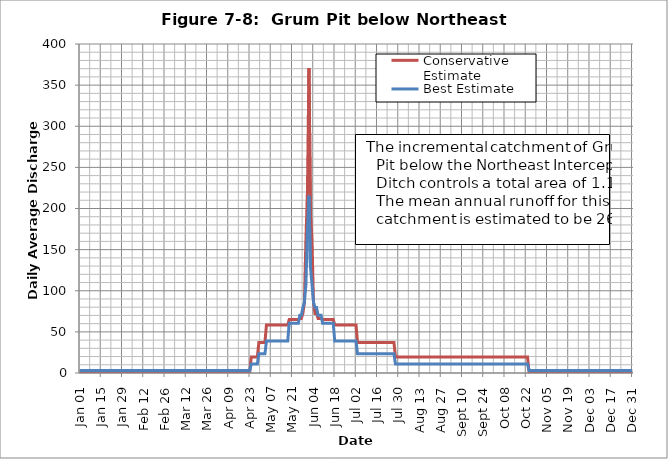
| Category | Conservative Estimate | Best Estimate |
|---|---|---|
| 2005-01-01 | 1.586 | 3.142 |
| 2005-01-02 | 1.586 | 3.142 |
| 2005-01-03 | 1.586 | 3.142 |
| 2005-01-04 | 1.586 | 3.142 |
| 2005-01-05 | 1.586 | 3.142 |
| 2005-01-06 | 1.586 | 3.142 |
| 2005-01-07 | 1.586 | 3.142 |
| 2005-01-08 | 1.586 | 3.142 |
| 2005-01-09 | 1.586 | 3.142 |
| 2005-01-10 | 1.586 | 3.142 |
| 2005-01-11 | 1.586 | 3.142 |
| 2005-01-12 | 1.586 | 3.142 |
| 2005-01-13 | 1.586 | 3.142 |
| 2005-01-14 | 1.586 | 3.142 |
| 2005-01-15 | 1.586 | 3.142 |
| 2005-01-16 | 1.586 | 3.142 |
| 2005-01-17 | 1.586 | 3.142 |
| 2005-01-18 | 1.586 | 3.142 |
| 2005-01-19 | 1.586 | 3.142 |
| 2005-01-20 | 1.586 | 3.142 |
| 2005-01-21 | 1.586 | 3.142 |
| 2005-01-22 | 1.586 | 3.142 |
| 2005-01-23 | 1.586 | 3.142 |
| 2005-01-24 | 1.586 | 3.142 |
| 2005-01-25 | 1.586 | 3.142 |
| 2005-01-26 | 1.586 | 3.142 |
| 2005-01-27 | 1.586 | 3.142 |
| 2005-01-28 | 1.586 | 3.142 |
| 2005-01-29 | 1.586 | 3.142 |
| 2005-01-30 | 1.586 | 3.142 |
| 2005-01-31 | 1.586 | 3.142 |
| 2005-02-01 | 1.586 | 3.142 |
| 2005-02-02 | 1.586 | 3.142 |
| 2005-02-03 | 1.586 | 3.142 |
| 2005-02-04 | 1.586 | 3.142 |
| 2005-02-05 | 1.586 | 3.142 |
| 2005-02-06 | 1.586 | 3.142 |
| 2005-02-07 | 1.586 | 3.142 |
| 2005-02-08 | 1.586 | 3.142 |
| 2005-02-09 | 1.586 | 3.142 |
| 2005-02-10 | 1.586 | 3.142 |
| 2005-02-11 | 1.586 | 3.142 |
| 2005-02-12 | 1.586 | 3.142 |
| 2005-02-13 | 1.586 | 3.142 |
| 2005-02-14 | 1.586 | 3.142 |
| 2005-02-15 | 1.586 | 3.142 |
| 2005-02-16 | 1.586 | 3.142 |
| 2005-02-17 | 1.586 | 3.142 |
| 2005-02-18 | 1.586 | 3.142 |
| 2005-02-19 | 1.586 | 3.142 |
| 2005-02-20 | 1.586 | 3.142 |
| 2005-02-21 | 1.586 | 3.142 |
| 2005-02-22 | 1.586 | 3.142 |
| 2005-02-23 | 1.586 | 3.142 |
| 2005-02-24 | 1.586 | 3.142 |
| 2005-02-25 | 1.586 | 3.142 |
| 2005-02-26 | 1.586 | 3.142 |
| 2005-02-27 | 1.586 | 3.142 |
| 2005-02-28 | 1.586 | 3.142 |
| 2005-03-01 | 1.586 | 3.142 |
| 2005-03-02 | 1.586 | 3.142 |
| 2005-03-03 | 1.586 | 3.142 |
| 2005-03-04 | 1.586 | 3.142 |
| 2005-03-05 | 1.586 | 3.142 |
| 2005-03-06 | 1.586 | 3.142 |
| 2005-03-07 | 1.586 | 3.142 |
| 2005-03-08 | 1.586 | 3.142 |
| 2005-03-09 | 1.586 | 3.142 |
| 2005-03-10 | 1.586 | 3.142 |
| 2005-03-11 | 1.586 | 3.142 |
| 2005-03-12 | 1.586 | 3.142 |
| 2005-03-13 | 1.586 | 3.142 |
| 2005-03-14 | 1.586 | 3.142 |
| 2005-03-15 | 1.586 | 3.142 |
| 2005-03-16 | 1.586 | 3.142 |
| 2005-03-17 | 1.586 | 3.142 |
| 2005-03-18 | 1.586 | 3.142 |
| 2005-03-19 | 1.586 | 3.142 |
| 2005-03-20 | 1.586 | 3.142 |
| 2005-03-21 | 1.586 | 3.142 |
| 2005-03-22 | 1.586 | 3.142 |
| 2005-03-23 | 1.586 | 3.142 |
| 2005-03-24 | 1.586 | 3.142 |
| 2005-03-25 | 1.586 | 3.142 |
| 2005-03-26 | 1.586 | 3.142 |
| 2005-03-27 | 1.586 | 3.142 |
| 2005-03-28 | 1.586 | 3.142 |
| 2005-03-29 | 1.586 | 3.142 |
| 2005-03-30 | 1.586 | 3.142 |
| 2005-03-31 | 1.586 | 3.142 |
| 2005-04-01 | 1.586 | 3.142 |
| 2005-04-02 | 1.586 | 3.142 |
| 2005-04-03 | 1.586 | 3.142 |
| 2005-04-04 | 1.586 | 3.142 |
| 2005-04-05 | 1.586 | 3.142 |
| 2005-04-06 | 1.586 | 3.142 |
| 2005-04-07 | 1.586 | 3.142 |
| 2005-04-08 | 1.586 | 3.142 |
| 2005-04-09 | 1.586 | 3.142 |
| 2005-04-10 | 1.586 | 3.142 |
| 2005-04-11 | 1.586 | 3.142 |
| 2005-04-12 | 1.586 | 3.142 |
| 2005-04-13 | 1.586 | 3.142 |
| 2005-04-14 | 1.586 | 3.142 |
| 2005-04-15 | 1.586 | 3.142 |
| 2005-04-16 | 1.586 | 3.142 |
| 2005-04-17 | 1.586 | 3.142 |
| 2005-04-18 | 1.586 | 3.142 |
| 2005-04-19 | 1.586 | 3.142 |
| 2005-04-20 | 1.586 | 3.142 |
| 2005-04-21 | 1.586 | 3.142 |
| 2005-04-22 | 1.586 | 3.142 |
| 2005-04-23 | 1.586 | 3.142 |
| 2005-04-24 | 19.514 | 10.882 |
| 2005-04-25 | 19.514 | 10.882 |
| 2005-04-26 | 19.514 | 10.882 |
| 2005-04-27 | 19.514 | 10.882 |
| 2005-04-28 | 19.514 | 10.882 |
| 2005-04-29 | 37.036 | 23.37 |
| 2005-04-30 | 37.036 | 23.37 |
| 2005-05-01 | 37.036 | 23.37 |
| 2005-05-02 | 37.036 | 23.37 |
| 2005-05-03 | 37.036 | 23.37 |
| 2005-05-04 | 58.487 | 38.863 |
| 2005-05-05 | 58.487 | 38.863 |
| 2005-05-06 | 58.487 | 38.863 |
| 2005-05-07 | 58.487 | 38.863 |
| 2005-05-08 | 58.487 | 38.863 |
| 2005-05-09 | 58.487 | 38.863 |
| 2005-05-10 | 58.487 | 38.863 |
| 2005-05-11 | 58.487 | 38.863 |
| 2005-05-12 | 58.487 | 38.863 |
| 2005-05-13 | 58.487 | 38.863 |
| 2005-05-14 | 58.487 | 38.863 |
| 2005-05-15 | 58.487 | 38.863 |
| 2005-05-16 | 58.487 | 38.863 |
| 2005-05-17 | 58.487 | 38.863 |
| 2005-05-18 | 58.487 | 38.863 |
| 2005-05-19 | 65.039 | 60.485 |
| 2005-05-20 | 65.039 | 60.485 |
| 2005-05-21 | 65.039 | 60.485 |
| 2005-05-22 | 65.039 | 60.485 |
| 2005-05-23 | 65.039 | 60.485 |
| 2005-05-24 | 65.039 | 60.485 |
| 2005-05-25 | 65.039 | 60.485 |
| 2005-05-26 | 66.398 | 70.12 |
| 2005-05-27 | 66.398 | 70.12 |
| 2005-05-28 | 72.401 | 79.548 |
| 2005-05-29 | 85.786 | 85.753 |
| 2005-05-30 | 161.646 | 107.992 |
| 2005-05-31 | 219.933 | 171.855 |
| 2005-06-01 | 370.5 | 215.408 |
| 2005-06-02 | 195.141 | 128.679 |
| 2005-06-03 | 161.646 | 107.992 |
| 2005-06-04 | 85.786 | 85.753 |
| 2005-06-05 | 72.401 | 79.548 |
| 2005-06-06 | 72.401 | 79.548 |
| 2005-06-07 | 66.398 | 70.12 |
| 2005-06-08 | 66.398 | 70.12 |
| 2005-06-09 | 66.398 | 70.12 |
| 2005-06-10 | 65.039 | 60.485 |
| 2005-06-11 | 65.039 | 60.485 |
| 2005-06-12 | 65.039 | 60.485 |
| 2005-06-13 | 65.039 | 60.485 |
| 2005-06-14 | 65.039 | 60.485 |
| 2005-06-15 | 65.039 | 60.485 |
| 2005-06-16 | 65.039 | 60.485 |
| 2005-06-17 | 65.039 | 60.485 |
| 2005-06-18 | 58.487 | 38.863 |
| 2005-06-19 | 58.487 | 38.863 |
| 2005-06-20 | 58.487 | 38.863 |
| 2005-06-21 | 58.487 | 38.863 |
| 2005-06-22 | 58.487 | 38.863 |
| 2005-06-23 | 58.487 | 38.863 |
| 2005-06-24 | 58.487 | 38.863 |
| 2005-06-25 | 58.487 | 38.863 |
| 2005-06-26 | 58.487 | 38.863 |
| 2005-06-27 | 58.487 | 38.863 |
| 2005-06-28 | 58.487 | 38.863 |
| 2005-06-29 | 58.487 | 38.863 |
| 2005-06-30 | 58.487 | 38.863 |
| 2005-07-01 | 58.487 | 38.863 |
| 2005-07-02 | 58.487 | 38.863 |
| 2005-07-03 | 37.036 | 23.37 |
| 2005-07-04 | 37.036 | 23.37 |
| 2005-07-05 | 37.036 | 23.37 |
| 2005-07-06 | 37.036 | 23.37 |
| 2005-07-07 | 37.036 | 23.37 |
| 2005-07-08 | 37.036 | 23.37 |
| 2005-07-09 | 37.036 | 23.37 |
| 2005-07-10 | 37.036 | 23.37 |
| 2005-07-11 | 37.036 | 23.37 |
| 2005-07-12 | 37.036 | 23.37 |
| 2005-07-13 | 37.036 | 23.37 |
| 2005-07-14 | 37.036 | 23.37 |
| 2005-07-15 | 37.036 | 23.37 |
| 2005-07-16 | 37.036 | 23.37 |
| 2005-07-17 | 37.036 | 23.37 |
| 2005-07-18 | 37.036 | 23.37 |
| 2005-07-19 | 37.036 | 23.37 |
| 2005-07-20 | 37.036 | 23.37 |
| 2005-07-21 | 37.036 | 23.37 |
| 2005-07-22 | 37.036 | 23.37 |
| 2005-07-23 | 37.036 | 23.37 |
| 2005-07-24 | 37.036 | 23.37 |
| 2005-07-25 | 37.036 | 23.37 |
| 2005-07-26 | 37.036 | 23.37 |
| 2005-07-27 | 37.036 | 23.37 |
| 2005-07-28 | 19.514 | 10.882 |
| 2005-07-29 | 19.514 | 10.882 |
| 2005-07-30 | 19.514 | 10.882 |
| 2005-07-31 | 19.514 | 10.882 |
| 2005-08-01 | 19.514 | 10.882 |
| 2005-08-02 | 19.514 | 10.882 |
| 2005-08-03 | 19.514 | 10.882 |
| 2005-08-04 | 19.514 | 10.882 |
| 2005-08-05 | 19.514 | 10.882 |
| 2005-08-06 | 19.514 | 10.882 |
| 2005-08-07 | 19.514 | 10.882 |
| 2005-08-08 | 19.514 | 10.882 |
| 2005-08-09 | 19.514 | 10.882 |
| 2005-08-10 | 19.514 | 10.882 |
| 2005-08-11 | 19.514 | 10.882 |
| 2005-08-12 | 19.514 | 10.882 |
| 2005-08-13 | 19.514 | 10.882 |
| 2005-08-14 | 19.514 | 10.882 |
| 2005-08-15 | 19.514 | 10.882 |
| 2005-08-16 | 19.514 | 10.882 |
| 2005-08-17 | 19.514 | 10.882 |
| 2005-08-18 | 19.514 | 10.882 |
| 2005-08-19 | 19.514 | 10.882 |
| 2005-08-20 | 19.514 | 10.882 |
| 2005-08-21 | 19.514 | 10.882 |
| 2005-08-22 | 19.514 | 10.882 |
| 2005-08-23 | 19.514 | 10.882 |
| 2005-08-24 | 19.514 | 10.882 |
| 2005-08-25 | 19.514 | 10.882 |
| 2005-08-26 | 19.514 | 10.882 |
| 2005-08-27 | 19.514 | 10.882 |
| 2005-08-28 | 19.514 | 10.882 |
| 2005-08-29 | 19.514 | 10.882 |
| 2005-08-30 | 19.514 | 10.882 |
| 2005-08-31 | 19.514 | 10.882 |
| 2005-09-01 | 19.514 | 10.882 |
| 2005-09-02 | 19.514 | 10.882 |
| 2005-09-03 | 19.514 | 10.882 |
| 2005-09-04 | 19.514 | 10.882 |
| 2005-09-05 | 19.514 | 10.882 |
| 2005-09-06 | 19.514 | 10.882 |
| 2005-09-07 | 19.514 | 10.882 |
| 2005-09-08 | 19.514 | 10.882 |
| 2005-09-09 | 19.514 | 10.882 |
| 2005-09-10 | 19.514 | 10.882 |
| 2005-09-11 | 19.514 | 10.882 |
| 2005-09-12 | 19.514 | 10.882 |
| 2005-09-13 | 19.514 | 10.882 |
| 2005-09-14 | 19.514 | 10.882 |
| 2005-09-15 | 19.514 | 10.882 |
| 2005-09-16 | 19.514 | 10.882 |
| 2005-09-17 | 19.514 | 10.882 |
| 2005-09-18 | 19.514 | 10.882 |
| 2005-09-19 | 19.514 | 10.882 |
| 2005-09-20 | 19.514 | 10.882 |
| 2005-09-21 | 19.514 | 10.882 |
| 2005-09-22 | 19.514 | 10.882 |
| 2005-09-23 | 19.514 | 10.882 |
| 2005-09-24 | 19.514 | 10.882 |
| 2005-09-25 | 19.514 | 10.882 |
| 2005-09-26 | 19.514 | 10.882 |
| 2005-09-27 | 19.514 | 10.882 |
| 2005-09-28 | 19.514 | 10.882 |
| 2005-09-29 | 19.514 | 10.882 |
| 2005-09-30 | 19.514 | 10.882 |
| 2005-10-01 | 19.514 | 10.882 |
| 2005-10-02 | 19.514 | 10.882 |
| 2005-10-03 | 19.514 | 10.882 |
| 2005-10-04 | 19.514 | 10.882 |
| 2005-10-05 | 19.514 | 10.882 |
| 2005-10-06 | 19.514 | 10.882 |
| 2005-10-07 | 19.514 | 10.882 |
| 2005-10-08 | 19.514 | 10.882 |
| 2005-10-09 | 19.514 | 10.882 |
| 2005-10-10 | 19.514 | 10.882 |
| 2005-10-11 | 19.514 | 10.882 |
| 2005-10-12 | 19.514 | 10.882 |
| 2005-10-13 | 19.514 | 10.882 |
| 2005-10-14 | 19.514 | 10.882 |
| 2005-10-15 | 19.514 | 10.882 |
| 2005-10-16 | 19.514 | 10.882 |
| 2005-10-17 | 19.514 | 10.882 |
| 2005-10-18 | 19.514 | 10.882 |
| 2005-10-19 | 19.514 | 10.882 |
| 2005-10-20 | 19.514 | 10.882 |
| 2005-10-21 | 19.514 | 10.882 |
| 2005-10-22 | 19.514 | 10.882 |
| 2005-10-23 | 19.514 | 10.882 |
| 2005-10-24 | 1.586 | 3.142 |
| 2005-10-25 | 1.586 | 3.142 |
| 2005-10-26 | 1.586 | 3.142 |
| 2005-10-27 | 1.586 | 3.142 |
| 2005-10-28 | 1.586 | 3.142 |
| 2005-10-29 | 1.586 | 3.142 |
| 2005-10-30 | 1.586 | 3.142 |
| 2005-10-31 | 1.586 | 3.142 |
| 2005-11-01 | 1.586 | 3.142 |
| 2005-11-02 | 1.586 | 3.142 |
| 2005-11-03 | 1.586 | 3.142 |
| 2005-11-04 | 1.586 | 3.142 |
| 2005-11-05 | 1.586 | 3.142 |
| 2005-11-06 | 1.586 | 3.142 |
| 2005-11-07 | 1.586 | 3.142 |
| 2005-11-08 | 1.586 | 3.142 |
| 2005-11-09 | 1.586 | 3.142 |
| 2005-11-10 | 1.586 | 3.142 |
| 2005-11-11 | 1.586 | 3.142 |
| 2005-11-12 | 1.586 | 3.142 |
| 2005-11-13 | 1.586 | 3.142 |
| 2005-11-14 | 1.586 | 3.142 |
| 2005-11-15 | 1.586 | 3.142 |
| 2005-11-16 | 1.586 | 3.142 |
| 2005-11-17 | 1.586 | 3.142 |
| 2005-11-18 | 1.586 | 3.142 |
| 2005-11-19 | 1.586 | 3.142 |
| 2005-11-20 | 1.586 | 3.142 |
| 2005-11-21 | 1.586 | 3.142 |
| 2005-11-22 | 1.586 | 3.142 |
| 2005-11-23 | 1.586 | 3.142 |
| 2005-11-24 | 1.586 | 3.142 |
| 2005-11-25 | 1.586 | 3.142 |
| 2005-11-26 | 1.586 | 3.142 |
| 2005-11-27 | 1.586 | 3.142 |
| 2005-11-28 | 1.586 | 3.142 |
| 2005-11-29 | 1.586 | 3.142 |
| 2005-11-30 | 1.586 | 3.142 |
| 2005-12-01 | 1.586 | 3.142 |
| 2005-12-02 | 1.586 | 3.142 |
| 2005-12-03 | 1.586 | 3.142 |
| 2005-12-04 | 1.586 | 3.142 |
| 2005-12-05 | 1.586 | 3.142 |
| 2005-12-06 | 1.586 | 3.142 |
| 2005-12-07 | 1.586 | 3.142 |
| 2005-12-08 | 1.586 | 3.142 |
| 2005-12-09 | 1.586 | 3.142 |
| 2005-12-10 | 1.586 | 3.142 |
| 2005-12-11 | 1.586 | 3.142 |
| 2005-12-12 | 1.586 | 3.142 |
| 2005-12-13 | 1.586 | 3.142 |
| 2005-12-14 | 1.586 | 3.142 |
| 2005-12-15 | 1.586 | 3.142 |
| 2005-12-16 | 1.586 | 3.142 |
| 2005-12-17 | 1.586 | 3.142 |
| 2005-12-18 | 1.586 | 3.142 |
| 2005-12-19 | 1.586 | 3.142 |
| 2005-12-20 | 1.586 | 3.142 |
| 2005-12-21 | 1.586 | 3.142 |
| 2005-12-22 | 1.586 | 3.142 |
| 2005-12-23 | 1.586 | 3.142 |
| 2005-12-24 | 1.586 | 3.142 |
| 2005-12-25 | 1.586 | 3.142 |
| 2005-12-26 | 1.586 | 3.142 |
| 2005-12-27 | 1.586 | 3.142 |
| 2005-12-28 | 1.586 | 3.142 |
| 2005-12-29 | 1.586 | 3.142 |
| 2005-12-30 | 1.586 | 3.142 |
| 2005-12-31 | 1.586 | 3.142 |